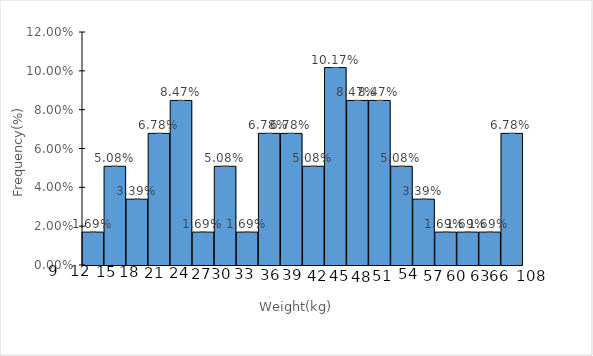
| Category | Fi |
|---|---|
| [9-12] | 0.017 |
| [12-15] | 0.051 |
| [15-18] | 0.034 |
| [18-21] | 0.068 |
| [21-24] | 0.085 |
| [24-27] | 0.017 |
| [27-30] | 0.051 |
| [30-33] | 0.017 |
| [33-36] | 0.068 |
| [36-39] | 0.068 |
| [39-42] | 0.051 |
| [42-45] | 0.102 |
| [45-48] | 0.085 |
| [48-51] | 0.085 |
| [51-54] | 0.051 |
| [54-57] | 0.034 |
| [57-60] | 0.017 |
| {60-63] | 0.017 |
| [63-66] | 0.017 |
| [66-108] | 0.068 |